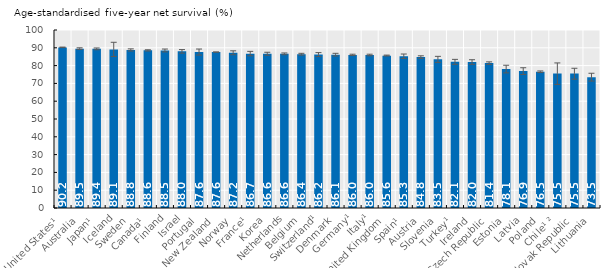
| Category | Series 0 |
|---|---|
| United States¹ | 90.2 |
| Australia | 89.5 |
| Japan¹ | 89.4 |
| Iceland | 89.1 |
| Sweden | 88.8 |
| Canada¹ | 88.6 |
| Finland | 88.5 |
| Israel | 88 |
| Portugal | 87.6 |
| New Zealand | 87.6 |
| Norway | 87.2 |
| France¹ | 86.7 |
| Korea | 86.6 |
| Netherlands | 86.6 |
| Belgium | 86.4 |
| Switzerland¹ | 86.2 |
| Denmark | 86.1 |
| Germany¹ | 86 |
| Italy¹ | 86 |
| United Kingdom | 85.6 |
| Spain¹ | 85.3 |
| Austria | 84.8 |
| Slovenia | 83.5 |
| Turkey¹ | 82.1 |
| Ireland | 82 |
| Czech Republic | 81.4 |
| Estonia | 78.1 |
| Latvia | 76.9 |
| Poland | 76.5 |
| Chile¹ ² | 75.5 |
| Slovak Republic | 75.5 |
| Lithuania | 73.5 |